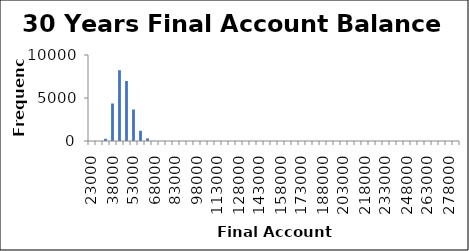
| Category | Frequency |
|---|---|
| 23000.0 | 0 |
| 28000.0 | 0 |
| 33000.0 | 257 |
| 38000.0 | 4360 |
| 43000.0 | 8230 |
| 48000.0 | 6975 |
| 53000.0 | 3664 |
| 58000.0 | 1187 |
| 63000.0 | 306 |
| 68000.0 | 21 |
| 73000.0 | 0 |
| 78000.0 | 0 |
| 83000.0 | 0 |
| 88000.0 | 0 |
| 93000.0 | 0 |
| 98000.0 | 0 |
| 103000.0 | 0 |
| 108000.0 | 0 |
| 113000.0 | 0 |
| 118000.0 | 0 |
| 123000.0 | 0 |
| 128000.0 | 0 |
| 133000.0 | 0 |
| 138000.0 | 0 |
| 143000.0 | 0 |
| 148000.0 | 0 |
| 153000.0 | 0 |
| 158000.0 | 0 |
| 163000.0 | 0 |
| 168000.0 | 0 |
| 173000.0 | 0 |
| 178000.0 | 0 |
| 183000.0 | 0 |
| 188000.0 | 0 |
| 193000.0 | 0 |
| 198000.0 | 0 |
| 203000.0 | 0 |
| 208000.0 | 0 |
| 213000.0 | 0 |
| 218000.0 | 0 |
| 223000.0 | 0 |
| 228000.0 | 0 |
| 233000.0 | 0 |
| 238000.0 | 0 |
| 243000.0 | 0 |
| 248000.0 | 0 |
| 253000.0 | 0 |
| 258000.0 | 0 |
| 263000.0 | 0 |
| 268000.0 | 0 |
| 273000.0 | 0 |
| 278000.0 | 0 |
| More | 0 |